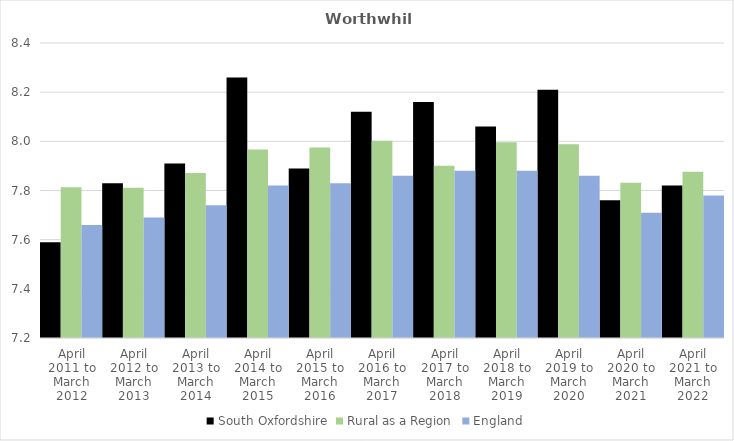
| Category | South Oxfordshire | Rural as a Region | England |
|---|---|---|---|
| April 2011 to March 2012 | 7.59 | 7.813 | 7.66 |
| April 2012 to March 2013 | 7.83 | 7.811 | 7.69 |
| April 2013 to March 2014 | 7.91 | 7.871 | 7.74 |
| April 2014 to March 2015 | 8.26 | 7.967 | 7.82 |
| April 2015 to March 2016 | 7.89 | 7.975 | 7.83 |
| April 2016 to March 2017 | 8.12 | 8.002 | 7.86 |
| April 2017 to March 2018 | 8.16 | 7.9 | 7.88 |
| April 2018 to March 2019 | 8.06 | 7.996 | 7.88 |
| April 2019 to March 2020 | 8.21 | 7.988 | 7.86 |
| April 2020 to March 2021 | 7.76 | 7.831 | 7.71 |
| April 2021 to March 2022 | 7.82 | 7.877 | 7.78 |